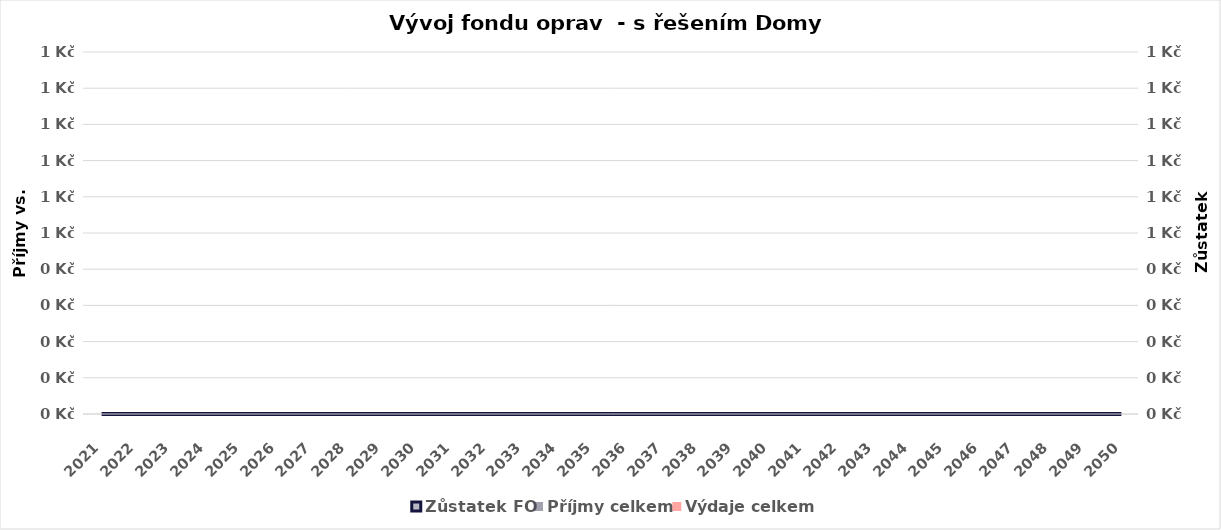
| Category | Příjmy celkem | Výdaje celkem |
|---|---|---|
| 2021.0 | 0 | 0 |
| 2022.0 | 0 | 0 |
| 2023.0 | 0 | 0 |
| 2024.0 | 0 | 0 |
| 2025.0 | 0 | 0 |
| 2026.0 | 0 | 0 |
| 2027.0 | 0 | 0 |
| 2028.0 | 0 | 0 |
| 2029.0 | 0 | 0 |
| 2030.0 | 0 | 0 |
| 2031.0 | 0 | 0 |
| 2032.0 | 0 | 0 |
| 2033.0 | 0 | 0 |
| 2034.0 | 0 | 0 |
| 2035.0 | 0 | 0 |
| 2036.0 | 0 | 0 |
| 2037.0 | 0 | 0 |
| 2038.0 | 0 | 0 |
| 2039.0 | 0 | 0 |
| 2040.0 | 0 | 0 |
| 2041.0 | 0 | 0 |
| 2042.0 | 0 | 0 |
| 2043.0 | 0 | 0 |
| 2044.0 | 0 | 0 |
| 2045.0 | 0 | 0 |
| 2046.0 | 0 | 0 |
| 2047.0 | 0 | 0 |
| 2048.0 | 0 | 0 |
| 2049.0 | 0 | 0 |
| 2050.0 | 0 | 0 |